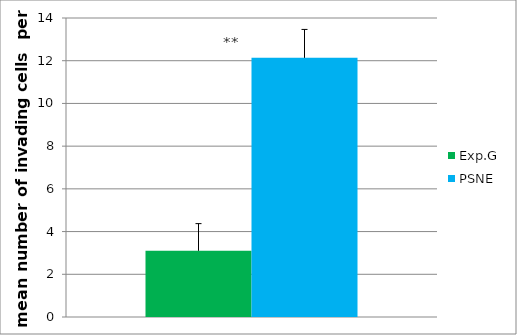
| Category | Exp.G | PSNE |
|---|---|---|
| 0 | 3.1 | 12.133 |